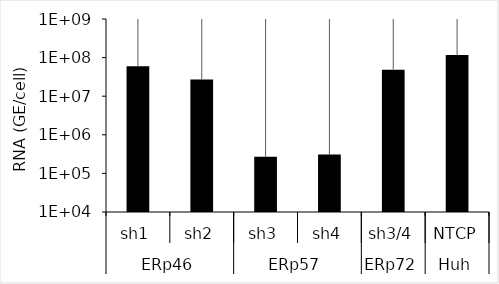
| Category | Series 0 |
|---|---|
| 0 | 59410047.023 |
| 1 | 27068052.349 |
| 2 | 269346.794 |
| 3 | 310013.841 |
| 4 | 48722046.513 |
| 5 | 117410628.857 |